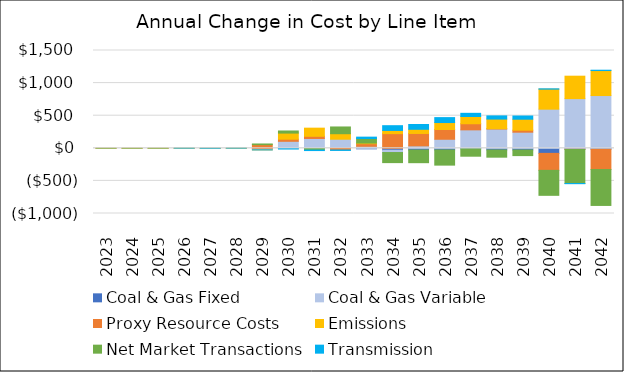
| Category | Coal & Gas Fixed | Coal & Gas Variable | Proxy Resource Costs | Emissions | Net Market Transactions | Transmission |
|---|---|---|---|---|---|---|
| 2023.0 | 0 | -0.79 | -0.005 | 0.02 | 0.72 | 0 |
| 2024.0 | 0 | -0.183 | 0.289 | -0.032 | 0.16 | 0 |
| 2025.0 | 0 | 0.126 | -0.417 | 0.051 | 0.67 | 0 |
| 2026.0 | 0 | 0.466 | 0.376 | 0.434 | 1.899 | 0.183 |
| 2027.0 | 0 | -0.926 | 1.319 | -0.536 | -0.423 | 0 |
| 2028.0 | 0 | -0.686 | 2.349 | -0.162 | 0.707 | 0.018 |
| 2029.0 | -4.439 | -18.808 | 56.127 | -0.466 | 10.248 | -0.275 |
| 2030.0 | -4.54 | 107.23 | 32.398 | 93.616 | 32.248 | -6.128 |
| 2031.0 | -4.644 | 150.788 | 33.108 | 124.961 | -22.783 | -7.25 |
| 2032.0 | 14.092 | 125.397 | -26 | 84.293 | 103.364 | -6.523 |
| 2033.0 | -7.98 | 30.841 | 39.97 | 9.721 | 69.54 | 21.086 |
| 2034.0 | -29.495 | -35.373 | 224.94 | 48.781 | -154.721 | 73.075 |
| 2035.0 | -26.617 | 37.46 | 190.151 | 63.968 | -194 | 73.919 |
| 2036.0 | -25.58 | 138.685 | 149.989 | 106.429 | -232.424 | 75.485 |
| 2037.0 | -8.346 | 282.958 | 93.692 | 111.123 | -112.851 | 48.673 |
| 2038.0 | -25.579 | 295.711 | 5.009 | 147.563 | -110.561 | 48.941 |
| 2039.0 | -26.162 | 247.099 | 30.638 | 168.388 | -85.925 | 49.227 |
| 2040.0 | -77.761 | 600.146 | -260.412 | 306.826 | -383.17 | 5.059 |
| 2041.0 | -14.439 | 762.075 | -3.496 | 343.888 | -522.446 | -1.844 |
| 2042.0 | -14.769 | 809.213 | -310.956 | 383.151 | -550.66 | 5.326 |